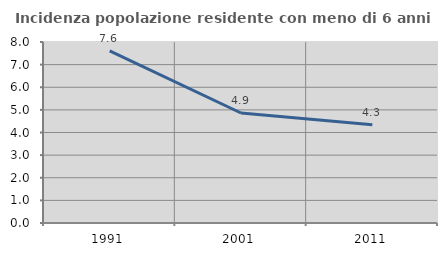
| Category | Incidenza popolazione residente con meno di 6 anni |
|---|---|
| 1991.0 | 7.612 |
| 2001.0 | 4.862 |
| 2011.0 | 4.34 |